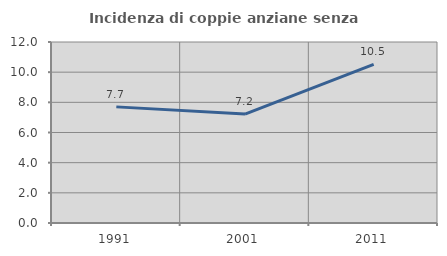
| Category | Incidenza di coppie anziane senza figli  |
|---|---|
| 1991.0 | 7.699 |
| 2001.0 | 7.222 |
| 2011.0 | 10.512 |